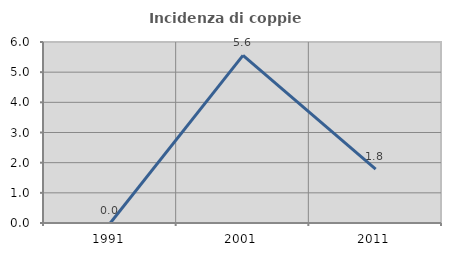
| Category | Incidenza di coppie miste |
|---|---|
| 1991.0 | 0 |
| 2001.0 | 5.556 |
| 2011.0 | 1.786 |